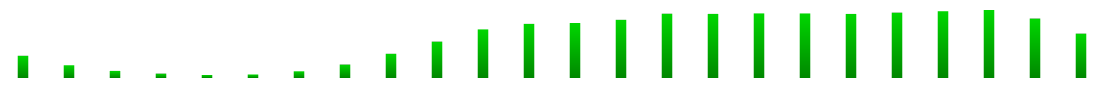
| Category | Series 0 |
|---|---|
| 0 | 0.023 |
| 1 | 0.013 |
| 2 | 0.007 |
| 3 | 0.004 |
| 4 | 0.003 |
| 5 | 0.004 |
| 6 | 0.007 |
| 7 | 0.014 |
| 8 | 0.025 |
| 9 | 0.037 |
| 10 | 0.05 |
| 11 | 0.056 |
| 12 | 0.056 |
| 13 | 0.06 |
| 14 | 0.066 |
| 15 | 0.066 |
| 16 | 0.066 |
| 17 | 0.066 |
| 18 | 0.066 |
| 19 | 0.067 |
| 20 | 0.068 |
| 21 | 0.07 |
| 22 | 0.061 |
| 23 | 0.045 |